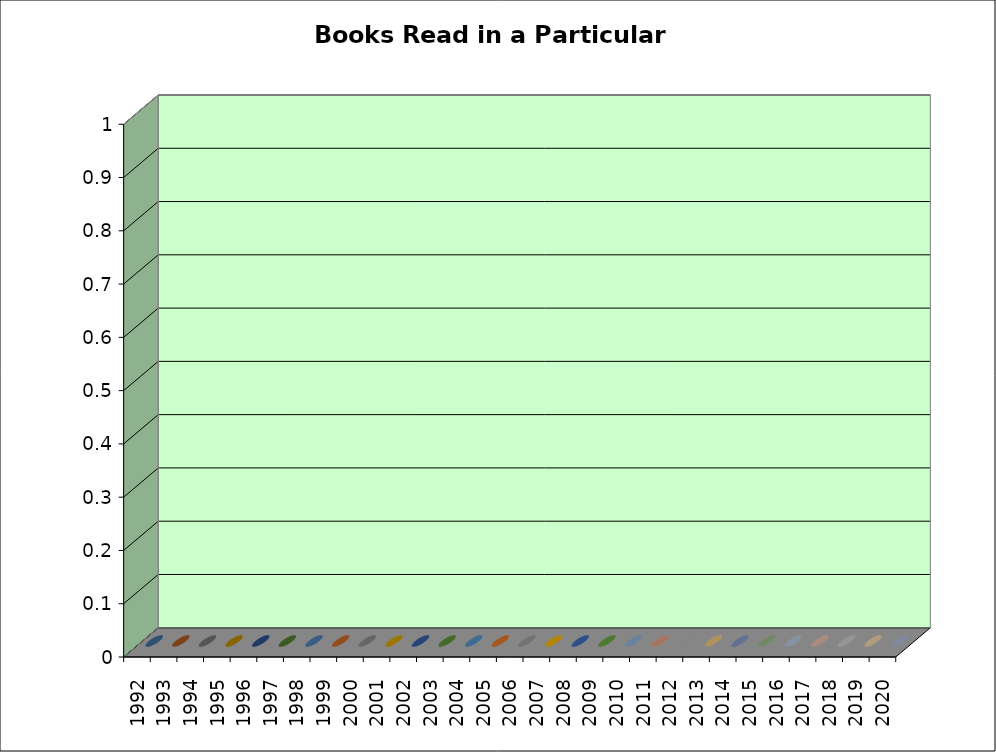
| Category | Series 0 |
|---|---|
| 1992.0 | 0 |
| 1993.0 | 0 |
| 1994.0 | 0 |
| 1995.0 | 0 |
| 1996.0 | 0 |
| 1997.0 | 0 |
| 1998.0 | 0 |
| 1999.0 | 0 |
| 2000.0 | 0 |
| 2001.0 | 0 |
| 2002.0 | 0 |
| 2003.0 | 0 |
| 2004.0 | 0 |
| 2005.0 | 0 |
| 2006.0 | 0 |
| 2007.0 | 0 |
| 2008.0 | 0 |
| 2009.0 | 0 |
| 2010.0 | 0 |
| 2011.0 | 0 |
| 2012.0 | 0 |
| 2013.0 | 0 |
| 2014.0 | 0 |
| 2015.0 | 0 |
| 2016.0 | 0 |
| 2017.0 | 0 |
| 2018.0 | 0 |
| 2019.0 | 0 |
| 2020.0 | 0 |